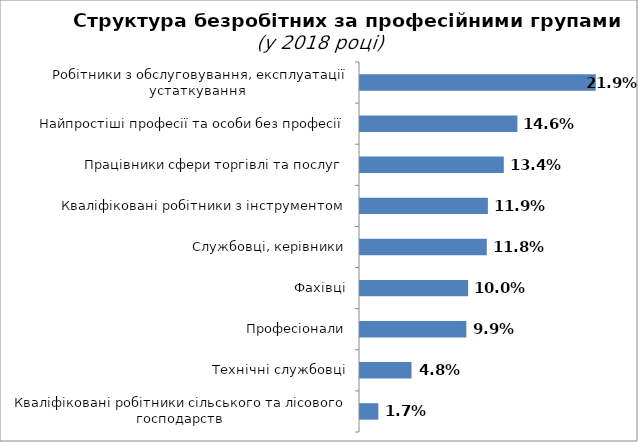
| Category | Series 0 |
|---|---|
| Робітники з обслуговування, експлуатації устаткування  | 0.219 |
| Найпростіші професії та особи без професії | 0.146 |
| Працівники сфери торгівлі та послуг | 0.134 |
| Кваліфіковані робітники з інструментом | 0.119 |
| Cлужбовці, керівники | 0.118 |
| Фахівці | 0.1 |
| Професіонали | 0.099 |
| Технічні службовці | 0.048 |
| Кваліфіковані робітники сільського та лісового господарств | 0.017 |